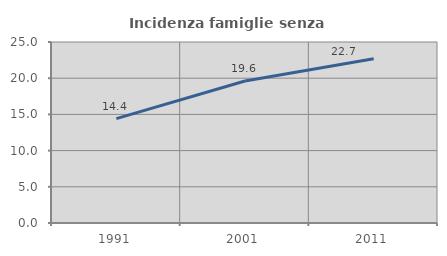
| Category | Incidenza famiglie senza nuclei |
|---|---|
| 1991.0 | 14.419 |
| 2001.0 | 19.619 |
| 2011.0 | 22.697 |